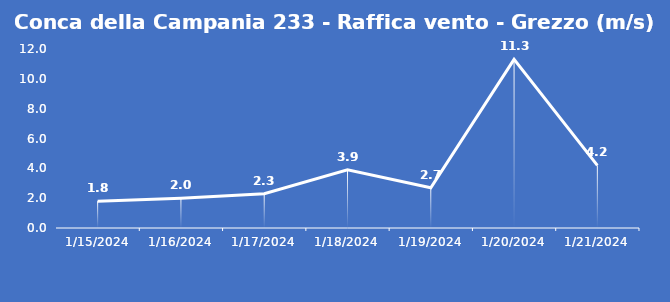
| Category | Conca della Campania 233 - Raffica vento - Grezzo (m/s) |
|---|---|
| 1/15/24 | 1.8 |
| 1/16/24 | 2 |
| 1/17/24 | 2.3 |
| 1/18/24 | 3.9 |
| 1/19/24 | 2.7 |
| 1/20/24 | 11.3 |
| 1/21/24 | 4.2 |